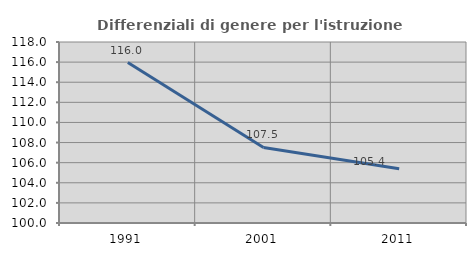
| Category | Differenziali di genere per l'istruzione superiore |
|---|---|
| 1991.0 | 115.956 |
| 2001.0 | 107.513 |
| 2011.0 | 105.389 |